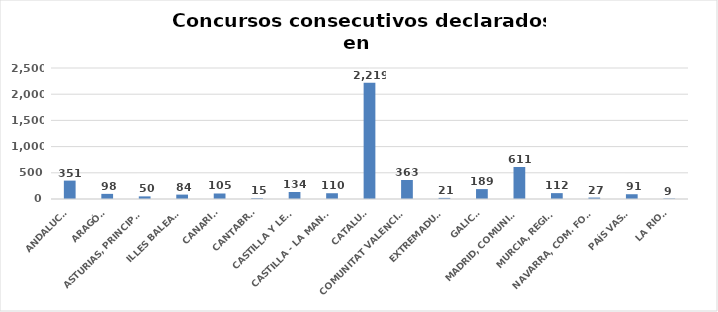
| Category | Series 0 |
|---|---|
| ANDALUCÍA | 351 |
| ARAGÓN | 98 |
| ASTURIAS, PRINCIPADO | 50 |
| ILLES BALEARS | 84 |
| CANARIAS | 105 |
| CANTABRIA | 15 |
| CASTILLA Y LEÓN | 134 |
| CASTILLA - LA MANCHA | 110 |
| CATALUÑA | 2219 |
| COMUNITAT VALENCIANA | 363 |
| EXTREMADURA | 21 |
| GALICIA | 189 |
| MADRID, COMUNIDAD | 611 |
| MURCIA, REGIÓN | 112 |
| NAVARRA, COM. FORAL | 27 |
| PAÍS VASCO | 91 |
| LA RIOJA | 9 |